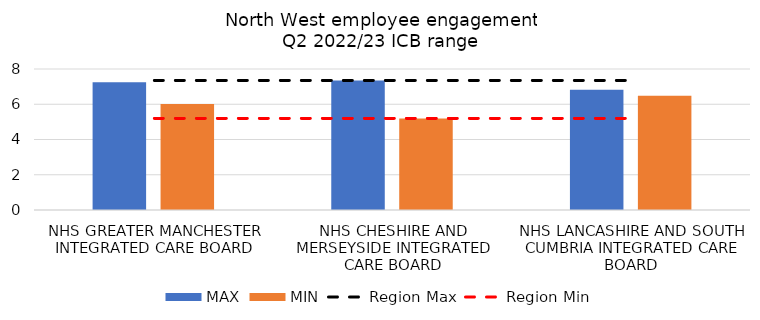
| Category | MAX | MIN |
|---|---|---|
| NHS GREATER MANCHESTER INTEGRATED CARE BOARD | 7.25 | 6.01 |
| NHS CHESHIRE AND MERSEYSIDE INTEGRATED CARE BOARD | 7.35 | 5.198 |
| NHS LANCASHIRE AND SOUTH CUMBRIA INTEGRATED CARE BOARD | 6.817 | 6.484 |